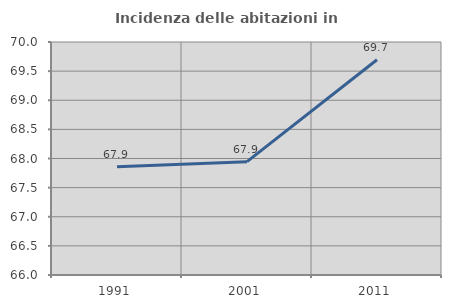
| Category | Incidenza delle abitazioni in proprietà  |
|---|---|
| 1991.0 | 67.857 |
| 2001.0 | 67.945 |
| 2011.0 | 69.696 |